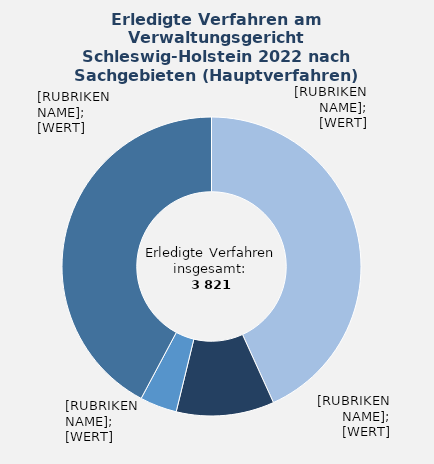
| Category | in Prozent |
|---|---|
| Asylrecht – Hauptsacheverfahren (Asylrecht, Verteilung von Asylbewerbenden) | 43.2 |
| Asylrecht – Hauptsacheverfahren (Dublin-Verfahren nach §29 Abs.1 Nr. 1 Buchst. a) AsylG)  | 10.6 |
| Bildungsrecht und Sport (ohne NC-Verfahren) | 4 |
| Übrige Sachgebiete¹ | 42.2 |